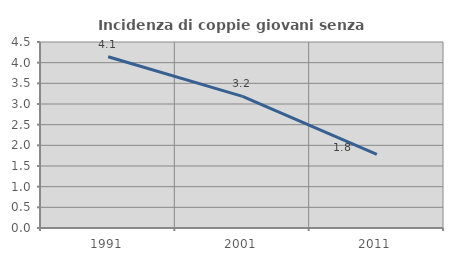
| Category | Incidenza di coppie giovani senza figli |
|---|---|
| 1991.0 | 4.144 |
| 2001.0 | 3.183 |
| 2011.0 | 1.781 |